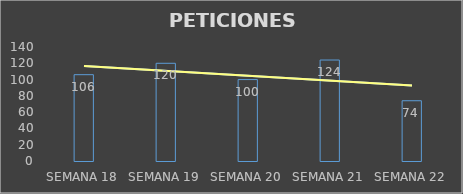
| Category | Series 0 |
|---|---|
| SEMANA 18 | 106 |
| SEMANA 19 | 120 |
| SEMANA 20 | 100 |
| SEMANA 21 | 124 |
| SEMANA 22 | 74 |